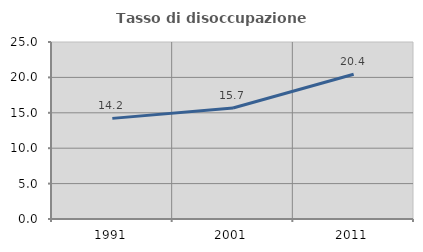
| Category | Tasso di disoccupazione giovanile  |
|---|---|
| 1991.0 | 14.213 |
| 2001.0 | 15.686 |
| 2011.0 | 20.442 |